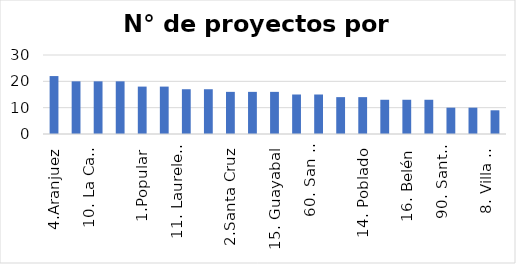
| Category | Series 0 |
|---|---|
| 4.Aranjuez | 22 |
| 9. Buenos Aires | 20 |
| 10. La Candelaria | 20 |
| 80. San Antonio de Prado | 20 |
| 1.Popular | 18 |
| 50. San Sebastián de Palmitas | 18 |
| 11. Laureles Estadio | 17 |
| 13. San Javier | 17 |
| 2.Santa Cruz | 16 |
| 5. Castilla | 16 |
| 15. Guayabal | 16 |
| 3. Manrique | 15 |
| 60. San Cristobal | 15 |
| 6. Doce de Octubre | 14 |
| 14. Poblado | 14 |
| 12. La América | 13 |
| 16. Belén | 13 |
| 70. Altavista | 13 |
| 90. Santa Elena | 10 |
| 7. Robledo | 10 |
| 8. Villa Hermosa | 9 |